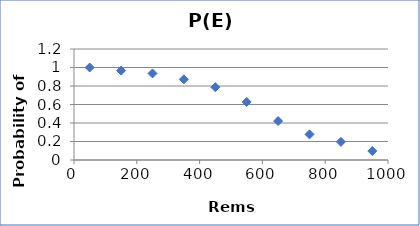
| Category | P(E) |
|---|---|
| 50.0 | 1 |
| 150.0 | 0.967 |
| 250.0 | 0.935 |
| 350.0 | 0.872 |
| 450.0 | 0.787 |
| 550.0 | 0.627 |
| 650.0 | 0.421 |
| 750.0 | 0.277 |
| 850.0 | 0.196 |
| 950.0 | 0.097 |